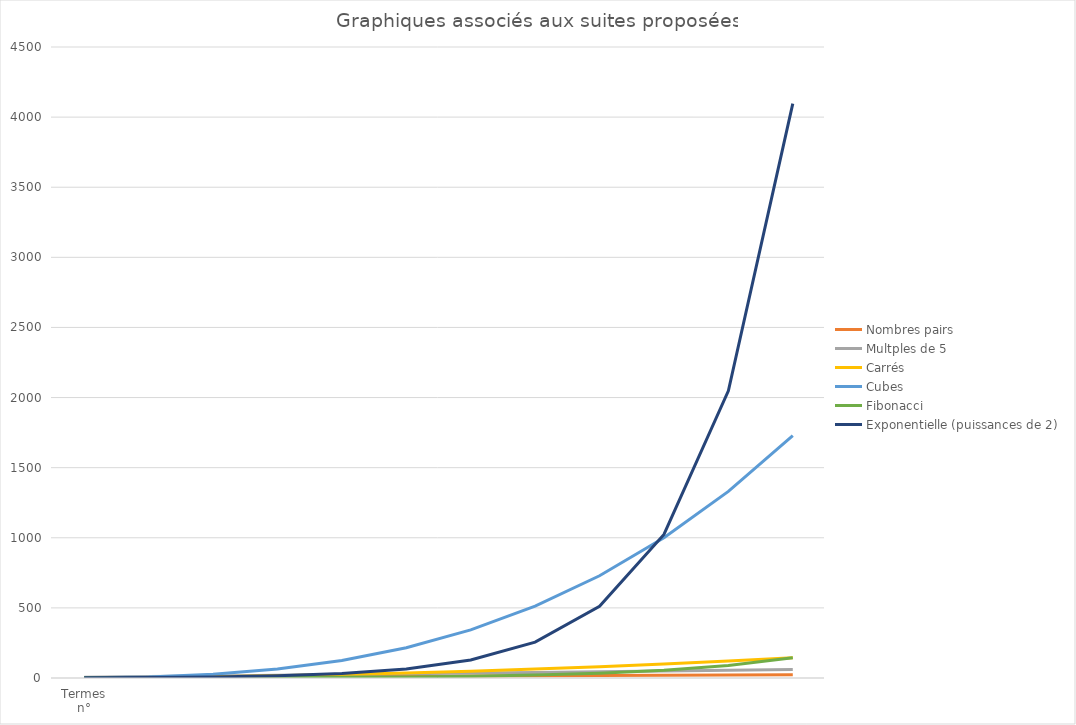
| Category | Nombres pairs | Multples de 5 | Carrés | Cubes | Fibonacci | Exponentielle (puissances de 2) |
|---|---|---|---|---|---|---|
| 0 | 2 | 5 | 1 | 1 | 1 | 2 |
| 1 | 4 | 10 | 4 | 8 | 1 | 4 |
| 2 | 6 | 15 | 9 | 27 | 2 | 8 |
| 3 | 8 | 20 | 16 | 64 | 3 | 16 |
| 4 | 10 | 25 | 25 | 125 | 5 | 32 |
| 5 | 12 | 30 | 36 | 216 | 8 | 64 |
| 6 | 14 | 35 | 49 | 343 | 13 | 128 |
| 7 | 16 | 40 | 64 | 512 | 21 | 256 |
| 8 | 18 | 45 | 81 | 729 | 34 | 512 |
| 9 | 20 | 50 | 100 | 1000 | 55 | 1024 |
| 10 | 22 | 55 | 121 | 1331 | 89 | 2048 |
| 11 | 24 | 60 | 144 | 1728 | 144 | 4096 |